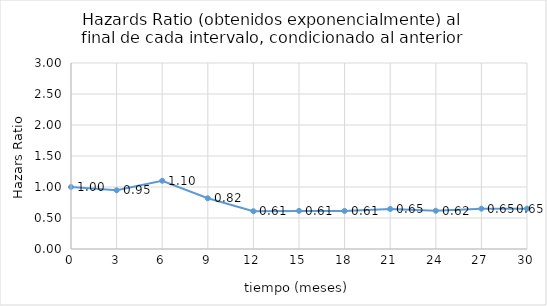
| Category | Series 0 |
|---|---|
| 0.0 | 1 |
| 3.0 | 0.947 |
| 6.0 | 1.1 |
| 9.0 | 0.818 |
| 12.0 | 0.61 |
| 15.0 | 0.615 |
| 18.0 | 0.613 |
| 21.0 | 0.645 |
| 24.0 | 0.616 |
| 27.0 | 0.65 |
| 30.0 | 0.65 |